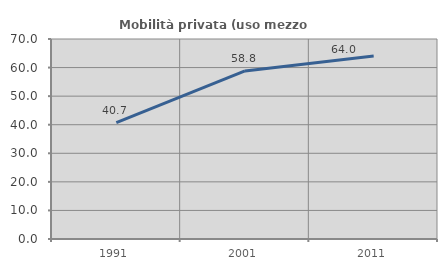
| Category | Mobilità privata (uso mezzo privato) |
|---|---|
| 1991.0 | 40.741 |
| 2001.0 | 58.828 |
| 2011.0 | 64.044 |